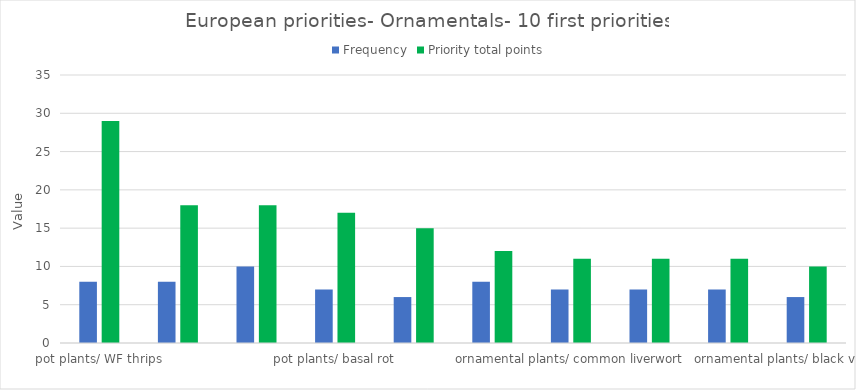
| Category | Frequency | Priority total points |
|---|---|---|
| pot plants/ WF thrips | 8 | 29 |
| pot plants/ silver-leaf whitefly | 8 | 18 |
| ornamental plants/ WF thrips | 10 | 18 |
| pot plants/ basal rot | 7 | 17 |
| pot plants/ greenhouse whitefly | 6 | 15 |
| ornamental plants/ long-tailed mealybug | 8 | 12 |
| ornamental plants/ common liverwort | 7 | 11 |
| pot plants/ broad mite | 7 | 11 |
| ornamental plants/ citrus mealybug | 7 | 11 |
| ornamental plants/ black vine weevil | 6 | 10 |